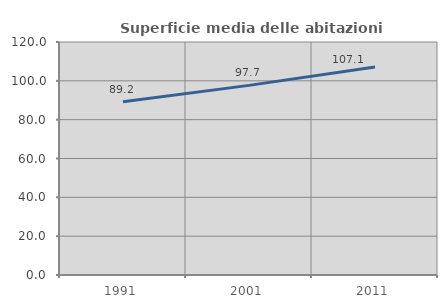
| Category | Superficie media delle abitazioni occupate |
|---|---|
| 1991.0 | 89.201 |
| 2001.0 | 97.66 |
| 2011.0 | 107.073 |